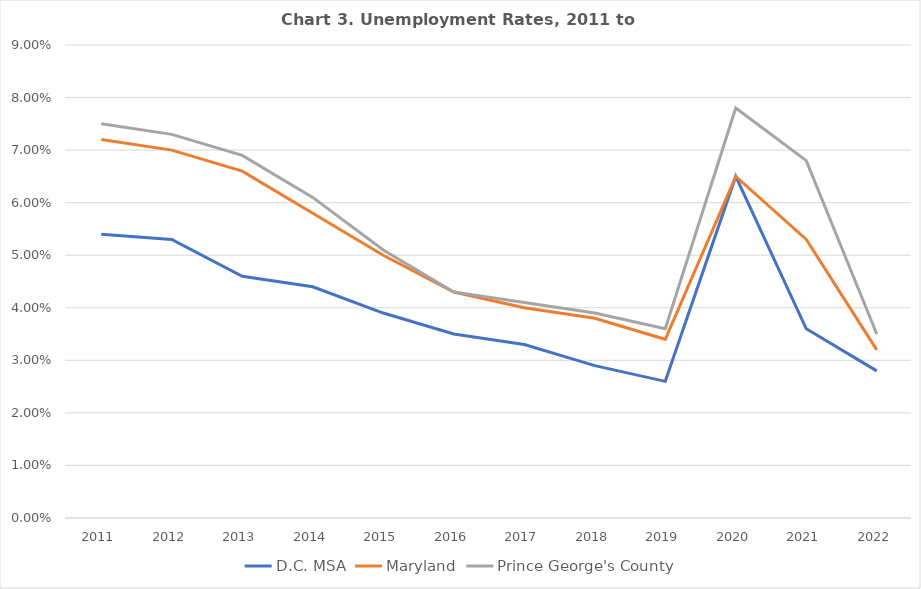
| Category | D.C. MSA | Maryland | Prince George's County |
|---|---|---|---|
| 2011 | 0.054 | 0.072 | 0.075 |
| 2012 | 0.053 | 0.07 | 0.073 |
| 2013 | 0.046 | 0.066 | 0.069 |
| 2014 | 0.044 | 0.058 | 0.061 |
| 2015 | 0.039 | 0.05 | 0.051 |
| 2016 | 0.035 | 0.043 | 0.043 |
| 2017 | 0.033 | 0.04 | 0.041 |
| 2018 | 0.029 | 0.038 | 0.039 |
| 2019 | 0.026 | 0.034 | 0.036 |
| 2020 | 0.065 | 0.065 | 0.078 |
| 2021 | 0.036 | 0.053 | 0.068 |
| 2022 | 0.028 | 0.032 | 0.035 |